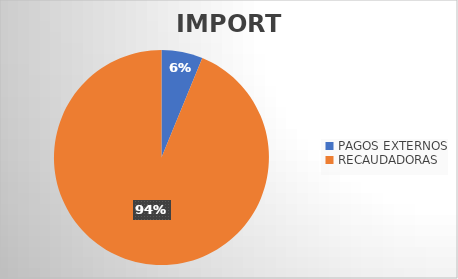
| Category | IMPORTE |
|---|---|
| PAGOS EXTERNOS | 14042794.31 |
| RECAUDADORAS | 212481308.94 |